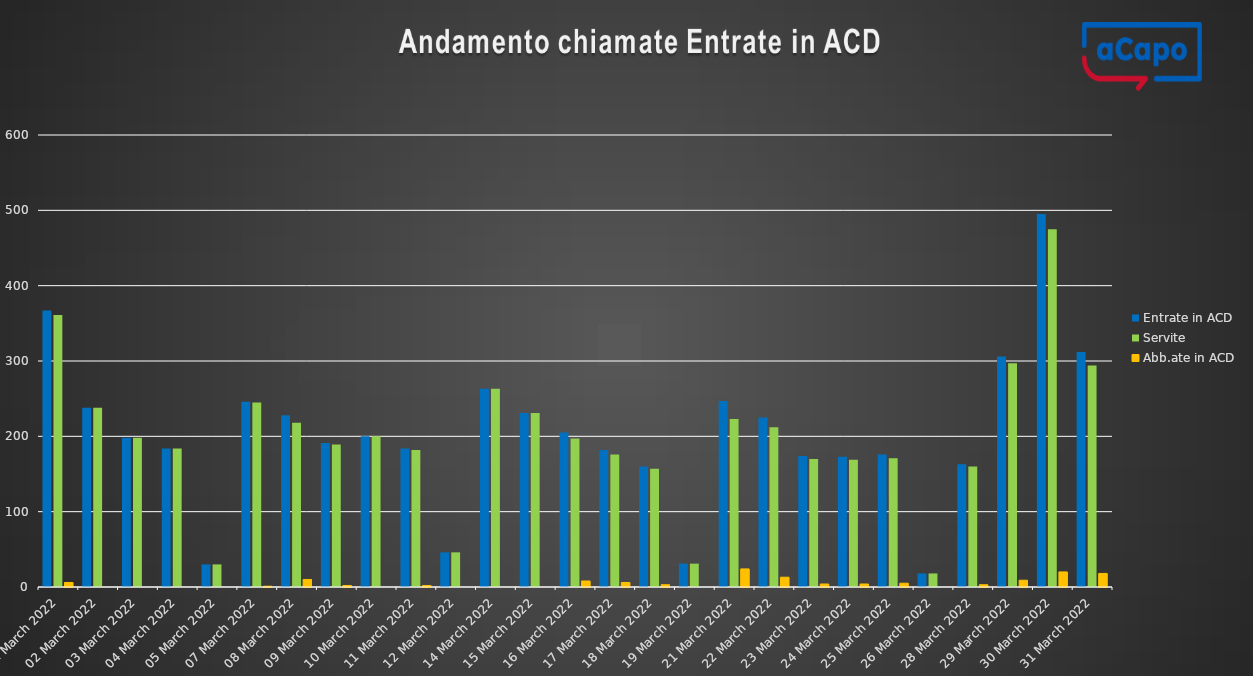
| Category | Entrate in ACD | Servite | Abb.ate in ACD |
|---|---|---|---|
| 2022-03-01 | 367 | 361 | 6 |
| 2022-03-02 | 238 | 238 | 0 |
| 2022-03-03 | 198 | 198 | 0 |
| 2022-03-04 | 184 | 184 | 0 |
| 2022-03-05 | 30 | 30 | 0 |
| 2022-03-07 | 246 | 245 | 1 |
| 2022-03-08 | 228 | 218 | 10 |
| 2022-03-09 | 191 | 189 | 2 |
| 2022-03-10 | 200 | 200 | 0 |
| 2022-03-11 | 184 | 182 | 2 |
| 2022-03-12 | 46 | 46 | 0 |
| 2022-03-14 | 263 | 263 | 0 |
| 2022-03-15 | 231 | 231 | 0 |
| 2022-03-16 | 205 | 197 | 8 |
| 2022-03-17 | 182 | 176 | 6 |
| 2022-03-18 | 160 | 157 | 3 |
| 2022-03-19 | 31 | 31 | 0 |
| 2022-03-21 | 247 | 223 | 24 |
| 2022-03-22 | 225 | 212 | 13 |
| 2022-03-23 | 174 | 170 | 4 |
| 2022-03-24 | 173 | 169 | 4 |
| 2022-03-25 | 176 | 171 | 5 |
| 2022-03-26 | 18 | 18 | 0 |
| 2022-03-28 | 163 | 160 | 3 |
| 2022-03-29 | 306 | 297 | 9 |
| 2022-03-30 | 495 | 475 | 20 |
| 2022-03-31 | 312 | 294 | 18 |